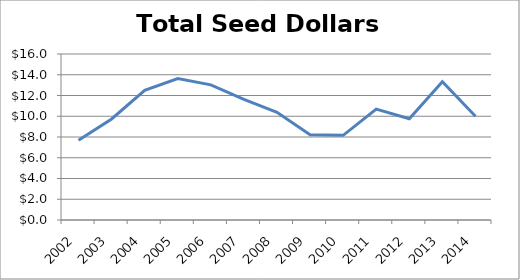
| Category | Total Seed Dollars |
|---|---|
| 2002.0 | 7.686 |
| 2003.0 | 9.739 |
| 2004.0 | 12.498 |
| 2005.0 | 13.626 |
| 2006.0 | 13.024 |
| 2007.0 | 11.632 |
| 2008.0 | 10.377 |
| 2009.0 | 8.211 |
| 2010.0 | 8.164 |
| 2011.0 | 10.693 |
| 2012.0 | 9.762 |
| 2013.0 | 13.325 |
| 2014.0 | 10 |